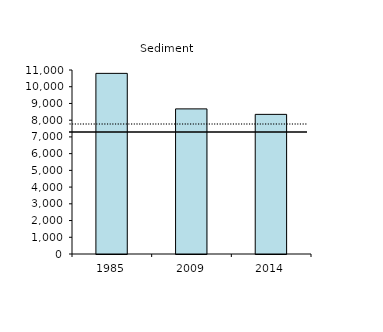
| Category | Series 0 |
|---|---|
| 1985.0 | 10798.384 |
| 2009.0 | 8675.252 |
| 2014.0 | 8347.844 |